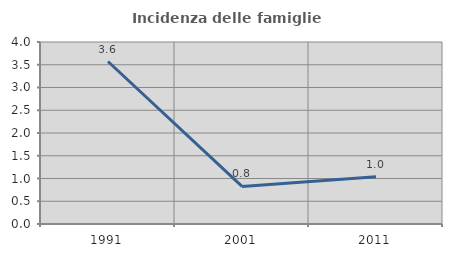
| Category | Incidenza delle famiglie numerose |
|---|---|
| 1991.0 | 3.571 |
| 2001.0 | 0.826 |
| 2011.0 | 1.039 |